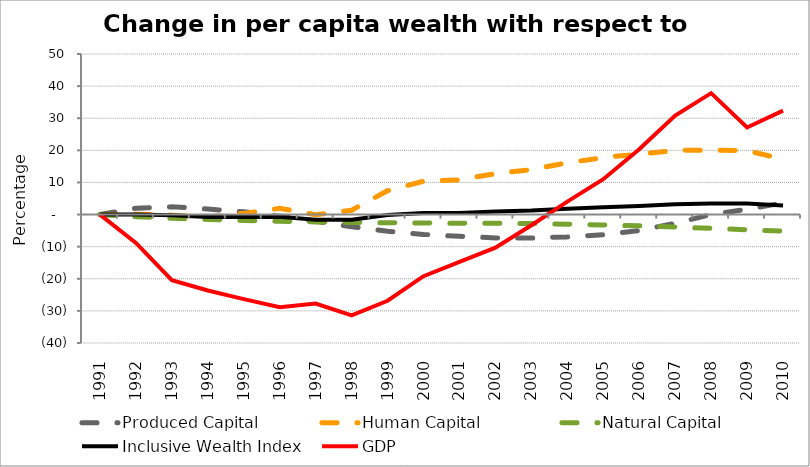
| Category | Produced Capital  | Human Capital | Natural Capital | Inclusive Wealth Index | GDP |
|---|---|---|---|---|---|
| 1991.0 | 0 | 0 | 0 | 0 | 0 |
| 1992.0 | 1.978 | 0.108 | -0.652 | 0.023 | -8.837 |
| 1993.0 | 2.409 | -0.182 | -1.146 | -0.252 | -20.441 |
| 1994.0 | 1.727 | -0.78 | -1.528 | -0.748 | -23.662 |
| 1995.0 | 0.863 | 0.374 | -1.842 | -0.735 | -26.333 |
| 1996.0 | -0.559 | 1.919 | -2.093 | -0.672 | -28.875 |
| 1997.0 | -2.083 | -0.068 | -2.287 | -1.613 | -27.738 |
| 1998.0 | -3.776 | 1.35 | -2.438 | -1.579 | -31.42 |
| 1999.0 | -5.216 | 7.425 | -2.552 | -0.142 | -26.835 |
| 2000.0 | -6.178 | 10.397 | -2.634 | 0.503 | -19.195 |
| 2001.0 | -6.792 | 10.817 | -2.69 | 0.487 | -14.735 |
| 2002.0 | -7.264 | 12.725 | -2.736 | 0.93 | -10.296 |
| 2003.0 | -7.305 | 13.996 | -2.822 | 1.242 | -3.327 |
| 2004.0 | -6.955 | 16.11 | -2.983 | 1.825 | 4.022 |
| 2005.0 | -6.276 | 17.749 | -3.232 | 2.28 | 11.012 |
| 2006.0 | -4.951 | 18.847 | -3.513 | 2.675 | 20.341 |
| 2007.0 | -2.72 | 19.977 | -3.88 | 3.19 | 30.809 |
| 2008.0 | 0.005 | 20.068 | -4.303 | 3.461 | 37.8 |
| 2009.0 | 1.665 | 19.898 | -4.73 | 3.469 | 27.12 |
| 2010.0 | 3.611 | 17.237 | -5.181 | 2.798 | 32.347 |